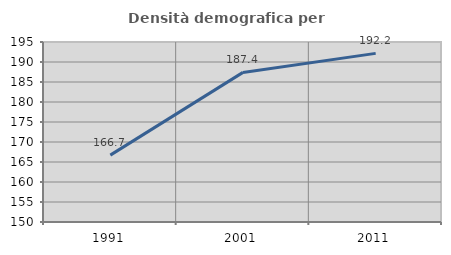
| Category | Densità demografica |
|---|---|
| 1991.0 | 166.722 |
| 2001.0 | 187.402 |
| 2011.0 | 192.155 |